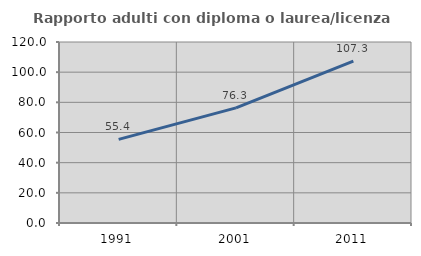
| Category | Rapporto adulti con diploma o laurea/licenza media  |
|---|---|
| 1991.0 | 55.418 |
| 2001.0 | 76.297 |
| 2011.0 | 107.265 |